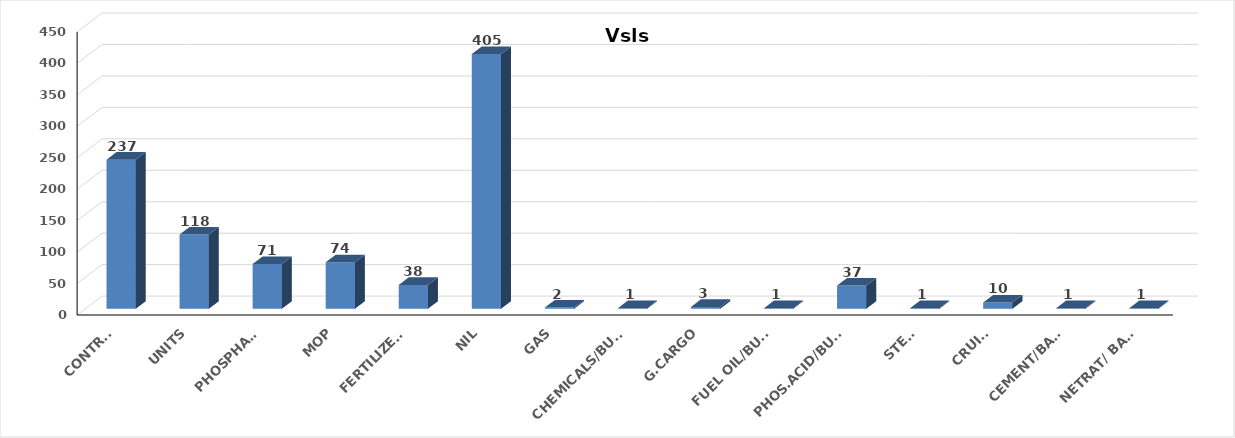
| Category | Series 0 |
|---|---|
| CONTRS. | 237 |
| UNITS | 118 |
| PHOSPHATE | 71 |
| MOP | 74 |
| FERTILIZERS | 38 |
| NIL | 405 |
| GAS | 2 |
| CHEMICALS/BULK | 1 |
| G.CARGO | 3 |
| FUEL OIL/BULK | 1 |
| PHOS.ACID/BULK | 37 |
| STEEL | 1 |
| CRUISE | 10 |
| CEMENT/BAGS | 1 |
| NETRAT/ BAGS | 1 |